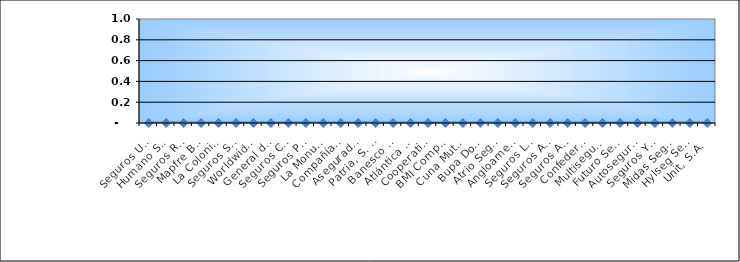
| Category | Series 0 |
|---|---|
| Seguros Universal, S. A. | 0 |
| Humano Seguros, S. A. | 0 |
| Seguros Reservas, S. A. | 0 |
| Mapfre BHD Compañía de Seguros | 0 |
| La Colonial, S. A., Compañia De Seguros | 0 |
| Seguros Sura, S.A. | 0 |
| Worldwide Seguros, S. A. | 0 |
| General de Seguros, S. A. | 0 |
| Seguros Crecer, S. A. | 0 |
| Seguros Pepín, S. A. | 0 |
| La Monumental de Seguros, S. A. | 0 |
| Compañía Dominicana de Seguros, C. por A. | 0 |
| Aseguradora Agropecuaria Dominicana, S. A. | 0 |
| Patria, S. A., Compañía de Seguros | 0 |
| Banesco Seguros | 0 |
| Atlántica Seguros, S. A. | 0 |
| Cooperativa Nacional De Seguros, Inc  | 0 |
| BMI Compañía de Seguros, S. A. | 0 |
| Cuna Mutual Insurance Society Dominicana | 0 |
| Bupa Dominicana, S. A. | 0 |
| Atrio Seguros S. A. | 0 |
| Angloamericana de Seguros, S. A. | 0 |
| Seguros La Internacional, S. A. | 0 |
| Seguros APS, S.R.L. | 0 |
| Seguros Ademi, S.A. | 0 |
| Confederación del Canadá Dominicana, S. A. | 0 |
| Multiseguros Su, S.A. | 0 |
| Futuro Seguros | 0 |
| Autoseguro, S. A. | 0 |
| Seguros Yunen, S.A. | 0 |
| Midas Seguros, S.A. | 0 |
| Hylseg Seguros S.A | 0 |
| Unit, S.A. | 0 |